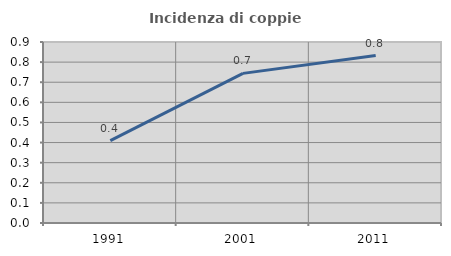
| Category | Incidenza di coppie miste |
|---|---|
| 1991.0 | 0.409 |
| 2001.0 | 0.744 |
| 2011.0 | 0.833 |